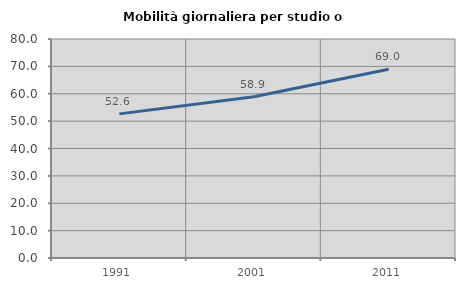
| Category | Mobilità giornaliera per studio o lavoro |
|---|---|
| 1991.0 | 52.646 |
| 2001.0 | 58.917 |
| 2011.0 | 68.977 |